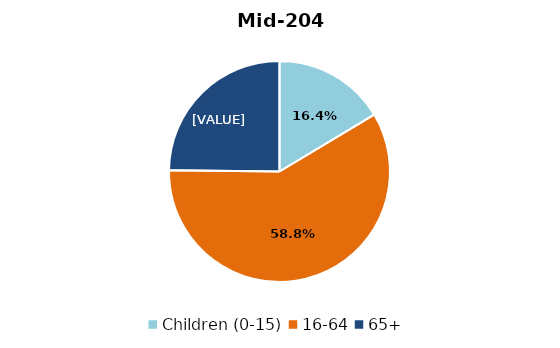
| Category | Series 0 |
|---|---|
| Children (0-15) | 0.164 |
| 16-64 | 0.588 |
| 65+ | 0.248 |